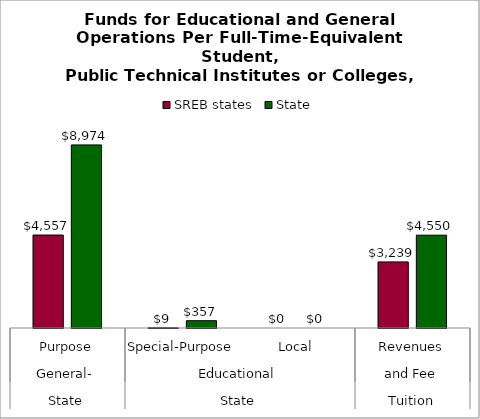
| Category | SREB states | State |
|---|---|---|
| 0 | 4557.147 | 8973.769 |
| 1 | 8.856 | 357.381 |
| 2 | 0 | 0 |
| 3 | 3239.384 | 4549.886 |